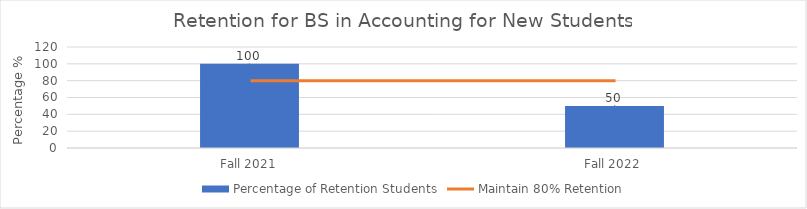
| Category | Percentage of Retention Students |
|---|---|
| Fall 2021 | 100 |
| Fall 2022 | 50 |